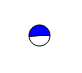
| Category | Series 0 |
|---|---|
| 0 | 3565927 |
| 1 | 3752272 |